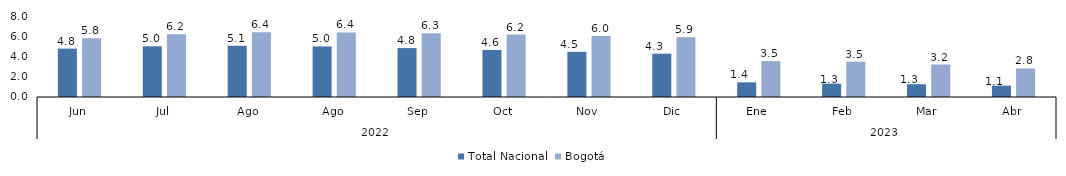
| Category | Total Nacional | Bogotá |
|---|---|---|
| 0 | 4.778 | 5.79 |
| 1 | 5.008 | 6.196 |
| 2 | 5.054 | 6.386 |
| 3 | 4.994 | 6.377 |
| 4 | 4.831 | 6.302 |
| 5 | 4.648 | 6.164 |
| 6 | 4.463 | 6.022 |
| 7 | 4.279 | 5.895 |
| 8 | 1.45 | 3.549 |
| 9 | 1.319 | 3.49 |
| 10 | 1.26 | 3.209 |
| 11 | 1.123 | 2.816 |